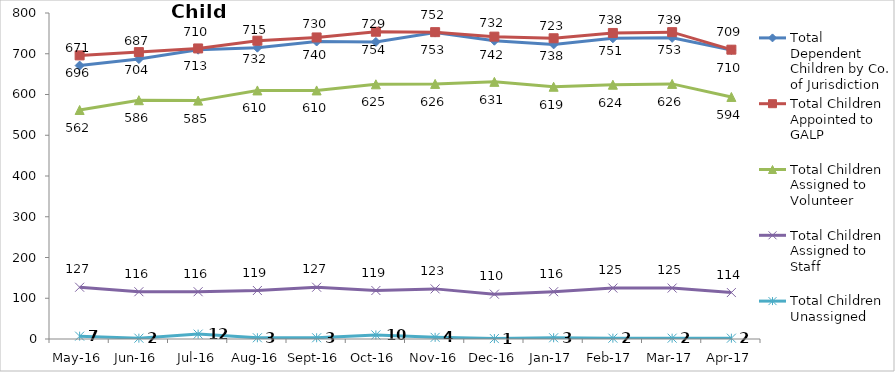
| Category | Total Dependent Children by Co. of Jurisdiction | Total Children Appointed to GALP | Total Children Assigned to Volunteer | Total Children Assigned to Staff | Total Children Unassigned |
|---|---|---|---|---|---|
| May-16 | 671 | 696 | 562 | 127 | 7 |
| Jun-16 | 687 | 704 | 586 | 116 | 2 |
| Jul-16 | 710 | 713 | 585 | 116 | 12 |
| Aug-16 | 715 | 732 | 610 | 119 | 3 |
| Sep-16 | 730 | 740 | 610 | 127 | 3 |
| Oct-16 | 729 | 754 | 625 | 119 | 10 |
| Nov-16 | 752 | 753 | 626 | 123 | 4 |
| Dec-16 | 732 | 742 | 631 | 110 | 1 |
| Jan-17 | 723 | 738 | 619 | 116 | 3 |
| Feb-17 | 738 | 751 | 624 | 125 | 2 |
| Mar-17 | 739 | 753 | 626 | 125 | 2 |
| Apr-17 | 709 | 710 | 594 | 114 | 2 |